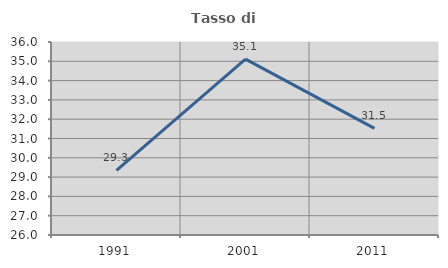
| Category | Tasso di occupazione   |
|---|---|
| 1991.0 | 29.348 |
| 2001.0 | 35.11 |
| 2011.0 | 31.525 |